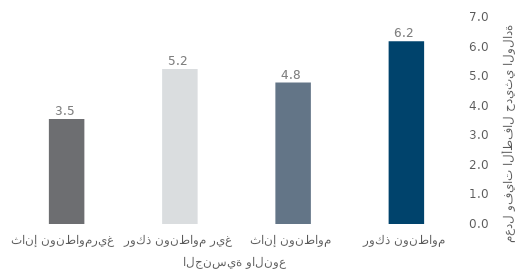
| Category | Series 0 |
|---|---|
| مواطنون ذكور | 6.176 |
| مواطنون إناث | 4.785 |
| غير مواطنون ذكور | 5.241 |
| غيرمواطنون إناث  | 3.549 |